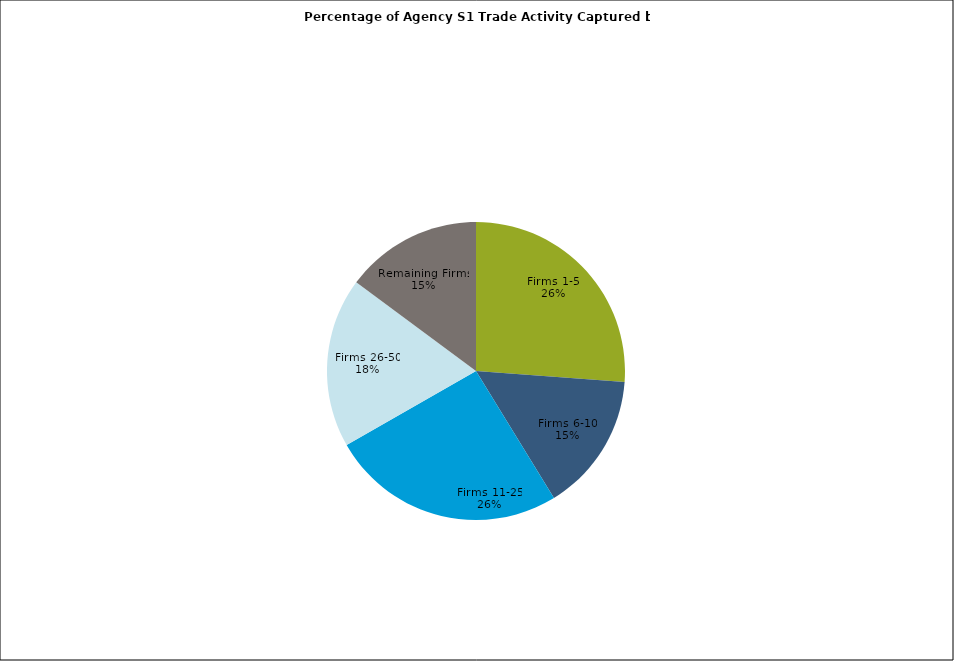
| Category | Series 0 |
|---|---|
| Firms 1-5 | 0.262 |
| Firms 6-10 | 0.151 |
| Firms 11-25 | 0.255 |
| Firms 26-50 | 0.184 |
| Remaining Firms | 0.149 |